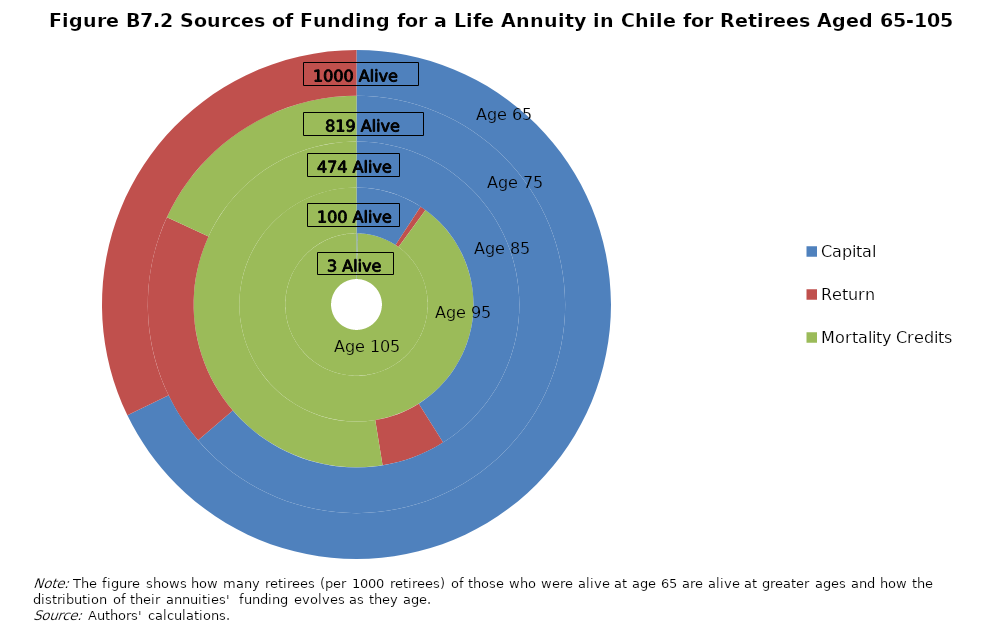
| Category | e | d | c | b | a |
|---|---|---|---|---|---|
| Capital | 0.209 | 7.166 | 31.875 | 49.448 | 52.636 |
| Return | 0.011 | 0.625 | 4.941 | 14.08 | 24.965 |
| Mortality Credits | 77.381 | 69.81 | 40.784 | 14.072 | 0 |